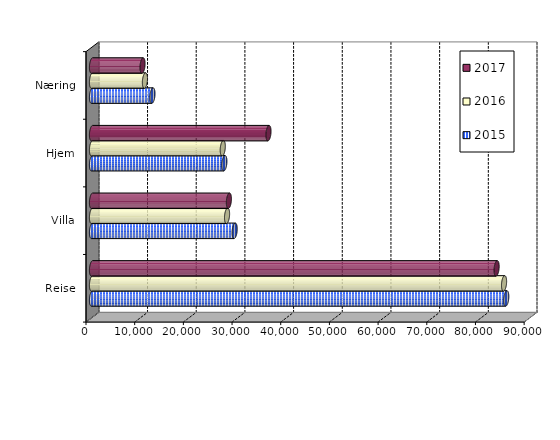
| Category | 2015 | 2016 | 2017 |
|---|---|---|---|
| Reise | 85093 | 84640 | 83111 |
| Villa | 29310 | 27740.369 | 28116.801 |
| Hjem | 27189 | 26862 | 36252.135 |
| Næring | 12417 | 10872.839 | 10382.716 |